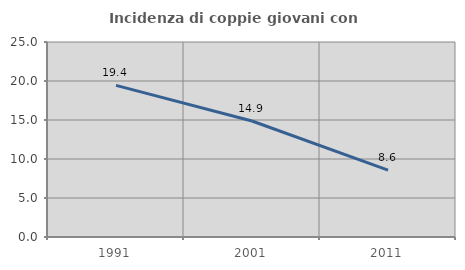
| Category | Incidenza di coppie giovani con figli |
|---|---|
| 1991.0 | 19.438 |
| 2001.0 | 14.875 |
| 2011.0 | 8.571 |